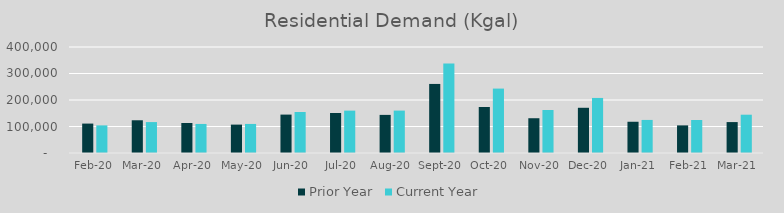
| Category | Prior Year | Current Year |
|---|---|---|
| 2020-02-01 | 111009.962 | 104204.224 |
| 2020-03-01 | 123525.131 | 116687.491 |
| 2020-04-01 | 113258.787 | 109598.965 |
| 2020-05-01 | 107128.051 | 109656.015 |
| 2020-06-01 | 144930.453 | 154696.236 |
| 2020-07-01 | 151028.014 | 159889.353 |
| 2020-08-01 | 143816.337 | 160013.985 |
| 2020-09-01 | 260607.456 | 337995.641 |
| 2020-10-01 | 173601.368 | 243049.084 |
| 2020-11-01 | 131198.833 | 162175.563 |
| 2020-12-01 | 170629.384 | 207737.904 |
| 2021-01-01 | 117899.625 | 124779.797 |
| 2021-02-01 | 104204.224 | 124538.238 |
| 2021-03-01 | 116687.491 | 144510.137 |